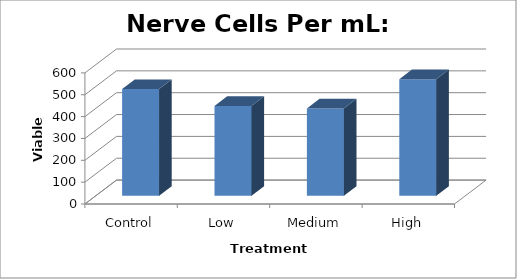
| Category | Series 0 |
|---|---|
| Control | 488.75 |
| Low | 411.25 |
| Medium | 400 |
| High | 533.75 |